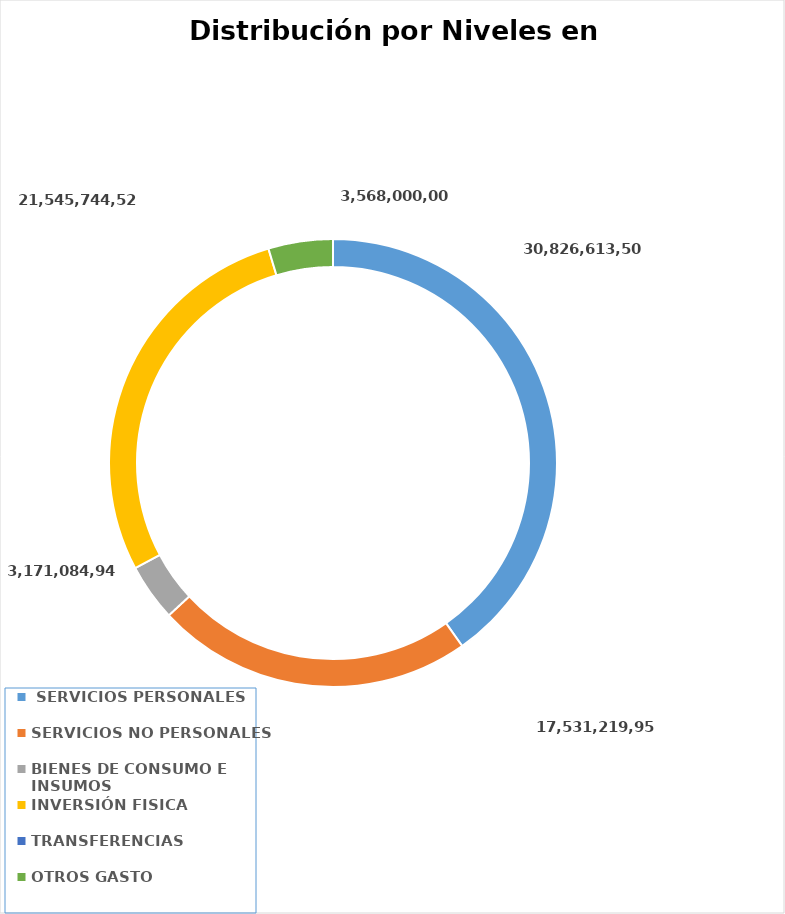
| Category | Series 0 | Series 1 |
|---|---|---|
|  SERVICIOS PERSONALES |  | 30826613504 |
| SERVICIOS NO PERSONALES |  | 17531219956 |
| BIENES DE CONSUMO E INSUMOS |  | 3171084948 |
| INVERSIÓN FISICA |  | 21545744525 |
| TRANSFERENCIAS |  | 0 |
| OTROS GASTO |  | 3568000000 |